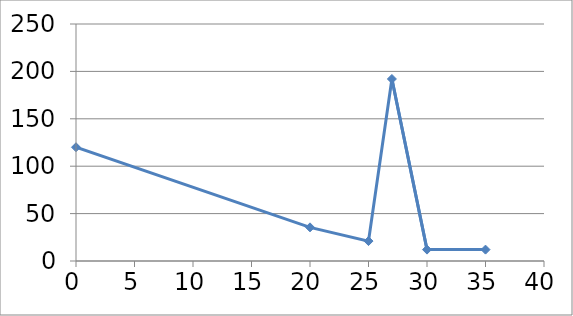
| Category | Series 0 |
|---|---|
| 0.0 | 120 |
| 20.0 | 35.5 |
| 25.0 | 21 |
| 27.0 | 192 |
| 30.0 | 12 |
| 35.0 | 12 |